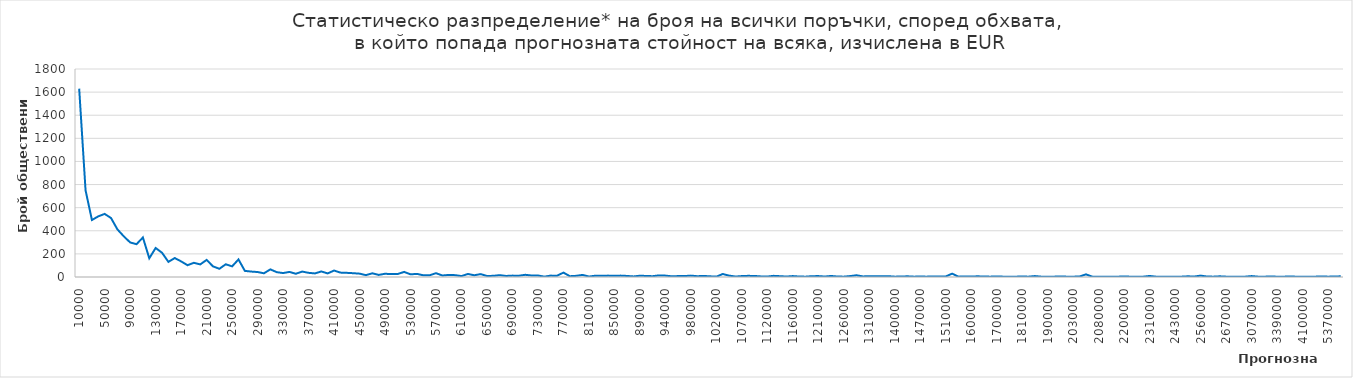
| Category | Series 0 |
|---|---|
| 10000.0 | 1630 |
| 20000.0 | 750 |
| 30000.0 | 493 |
| 40000.0 | 525 |
| 50000.0 | 546 |
| 60000.0 | 510 |
| 70000.0 | 412 |
| 80000.0 | 352 |
| 90000.0 | 299 |
| 100000.0 | 284 |
| 110000.0 | 342 |
| 120000.0 | 162 |
| 130000.0 | 251 |
| 140000.0 | 210 |
| 150000.0 | 131 |
| 160000.0 | 164 |
| 170000.0 | 135 |
| 180000.0 | 102 |
| 190000.0 | 123 |
| 200000.0 | 109 |
| 210000.0 | 148 |
| 220000.0 | 92 |
| 230000.0 | 71 |
| 240000.0 | 110 |
| 250000.0 | 92 |
| 260000.0 | 152 |
| 270000.0 | 53 |
| 280000.0 | 47 |
| 290000.0 | 43 |
| 300000.0 | 32 |
| 310000.0 | 66 |
| 320000.0 | 42 |
| 330000.0 | 34 |
| 340000.0 | 44 |
| 350000.0 | 28 |
| 360000.0 | 47 |
| 370000.0 | 36 |
| 380000.0 | 31 |
| 390000.0 | 48 |
| 400000.0 | 31 |
| 410000.0 | 56 |
| 420000.0 | 38 |
| 430000.0 | 36 |
| 440000.0 | 33 |
| 450000.0 | 29 |
| 460000.0 | 16 |
| 470000.0 | 32 |
| 480000.0 | 18 |
| 490000.0 | 28 |
| 500000.0 | 25 |
| 510000.0 | 26 |
| 520000.0 | 44 |
| 530000.0 | 23 |
| 540000.0 | 27 |
| 550000.0 | 15 |
| 560000.0 | 15 |
| 570000.0 | 33 |
| 580000.0 | 13 |
| 590000.0 | 18 |
| 600000.0 | 16 |
| 610000.0 | 8 |
| 620000.0 | 26 |
| 630000.0 | 15 |
| 640000.0 | 25 |
| 650000.0 | 9 |
| 660000.0 | 10 |
| 670000.0 | 16 |
| 680000.0 | 9 |
| 690000.0 | 12 |
| 700000.0 | 11 |
| 710000.0 | 19 |
| 720000.0 | 13 |
| 730000.0 | 13 |
| 740000.0 | 3 |
| 750000.0 | 12 |
| 760000.0 | 11 |
| 770000.0 | 38 |
| 780000.0 | 7 |
| 790000.0 | 10 |
| 800000.0 | 18 |
| 810000.0 | 4 |
| 820000.0 | 11 |
| 830000.0 | 10 |
| 840000.0 | 12 |
| 850000.0 | 10 |
| 860000.0 | 12 |
| 870000.0 | 9 |
| 880000.0 | 5 |
| 890000.0 | 11 |
| 900000.0 | 9 |
| 910000.0 | 7 |
| 930000.0 | 14 |
| 940000.0 | 12 |
| 950000.0 | 6 |
| 960000.0 | 8 |
| 970000.0 | 8 |
| 980000.0 | 12 |
| 990000.0 | 7 |
| 1000000.0 | 9 |
| 1010000.0 | 6 |
| 1020000.0 | 3 |
| 1030000.0 | 26 |
| 1040000.0 | 12 |
| 1060000.0 | 4 |
| 1070000.0 | 8 |
| 1080000.0 | 10 |
| 1090000.0 | 9 |
| 1110000.0 | 5 |
| 1120000.0 | 4 |
| 1130000.0 | 10 |
| 1140000.0 | 7 |
| 1150000.0 | 4 |
| 1160000.0 | 8 |
| 1180000.0 | 4 |
| 1190000.0 | 3 |
| 1200000.0 | 7 |
| 1210000.0 | 8 |
| 1220000.0 | 4 |
| 1230000.0 | 9 |
| 1250000.0 | 4 |
| 1260000.0 | 3 |
| 1270000.0 | 8 |
| 1280000.0 | 15 |
| 1290000.0 | 5 |
| 1310000.0 | 7 |
| 1330000.0 | 7 |
| 1340000.0 | 7 |
| 1390000.0 | 7 |
| 1400000.0 | 3 |
| 1410000.0 | 4 |
| 1440000.0 | 6 |
| 1450000.0 | 3 |
| 1470000.0 | 4 |
| 1480000.0 | 3 |
| 1490000.0 | 5 |
| 1500000.0 | 5 |
| 1510000.0 | 5 |
| 1540000.0 | 29 |
| 1580000.0 | 3 |
| 1590000.0 | 5 |
| 1600000.0 | 4 |
| 1630000.0 | 6 |
| 1650000.0 | 4 |
| 1670000.0 | 3 |
| 1700000.0 | 5 |
| 1740000.0 | 3 |
| 1770000.0 | 3 |
| 1780000.0 | 3 |
| 1810000.0 | 4 |
| 1820000.0 | 3 |
| 1850000.0 | 8 |
| 1880000.0 | 3 |
| 1900000.0 | 3 |
| 1910000.0 | 3 |
| 1920000.0 | 5 |
| 1970000.0 | 3 |
| 2030000.0 | 3 |
| 2040000.0 | 4 |
| 2050000.0 | 23 |
| 2070000.0 | 3 |
| 2080000.0 | 3 |
| 2100000.0 | 3 |
| 2140000.0 | 3 |
| 2180000.0 | 3 |
| 2200000.0 | 4 |
| 2250000.0 | 3 |
| 2260000.0 | 3 |
| 2300000.0 | 3 |
| 2310000.0 | 9 |
| 2320000.0 | 3 |
| 2340000.0 | 3 |
| 2390000.0 | 3 |
| 2430000.0 | 3 |
| 2470000.0 | 3 |
| 2500000.0 | 6 |
| 2540000.0 | 4 |
| 2560000.0 | 12 |
| 2590000.0 | 4 |
| 2600000.0 | 3 |
| 2660000.0 | 6 |
| 2670000.0 | 3 |
| 2820000.0 | 3 |
| 2910000.0 | 3 |
| 3020000.0 | 3 |
| 3070000.0 | 8 |
| 3080000.0 | 3 |
| 3180000.0 | 3 |
| 3330000.0 | 4 |
| 3390000.0 | 3 |
| 3580000.0 | 3 |
| 3690000.0 | 4 |
| 3900000.0 | 3 |
| 4100000.0 | 3 |
| 4280000.0 | 3 |
| 4610000.0 | 3 |
| 5120000.0 | 5 |
| 5370000.0 | 3 |
| 7670000.0 | 4 |
| 15340000.0 | 6 |